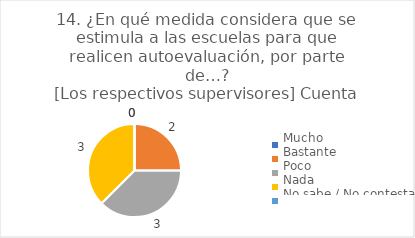
| Category | 14. ¿En qué medida considera que se estimula a las escuelas para que realicen autoevaluación, por parte de…?
[Los respectivos supervisores] |
|---|---|
| Mucho  | 0 |
| Bastante  | 0.25 |
| Poco  | 0.375 |
| Nada  | 0.375 |
| No sabe / No contesta | 0 |